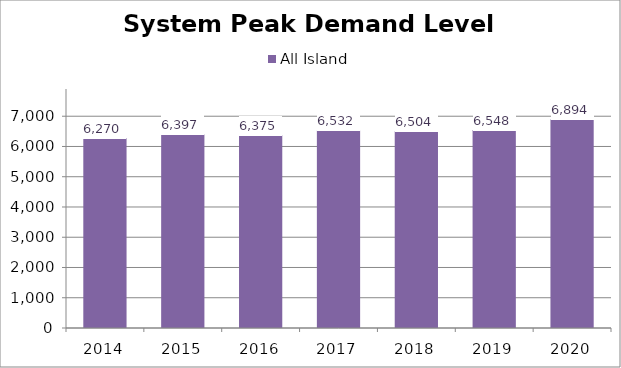
| Category | All Island |
|---|---|
| 2014.0 | 6269.63 |
| 2015.0 | 6396.95 |
| 2016.0 | 6375.021 |
| 2017.0 | 6531.683 |
| 2018.0 | 6504.008 |
| 2019.0 | 6547.514 |
| 2020.0 | 6894.431 |